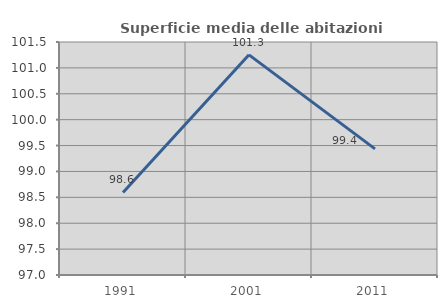
| Category | Superficie media delle abitazioni occupate |
|---|---|
| 1991.0 | 98.595 |
| 2001.0 | 101.252 |
| 2011.0 | 99.436 |